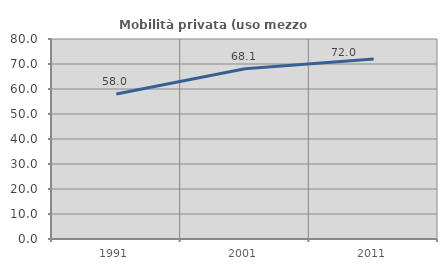
| Category | Mobilità privata (uso mezzo privato) |
|---|---|
| 1991.0 | 57.989 |
| 2001.0 | 68.12 |
| 2011.0 | 71.996 |